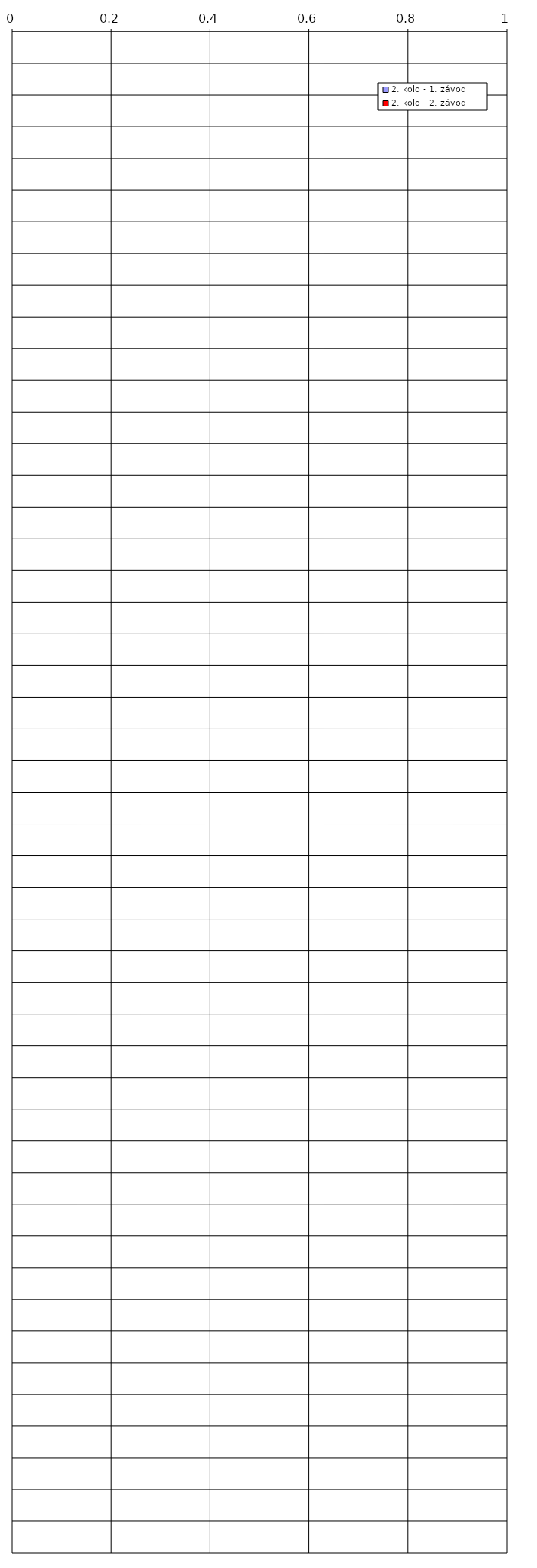
| Category | 2. kolo - 1. závod | 2. kolo - 2. závod |
|---|---|---|
| 0 | 0 | 0 |
| 1 | 0 | 0 |
| 2 | 0 | 0 |
| 3 | 0 | 0 |
| 4 | 0 | 0 |
| 5 | 0 | 0 |
| 6 | 0 | 0 |
| 7 | 0 | 0 |
| 8 | 0 | 0 |
| 9 | 0 | 0 |
| 10 | 0 | 0 |
| 11 | 0 | 0 |
| 12 | 0 | 0 |
| 13 | 0 | 0 |
| 14 | 0 | 0 |
| 15 | 0 | 0 |
| 16 | 0 | 0 |
| 17 | 0 | 0 |
| 18 | 0 | 0 |
| 19 | 0 | 0 |
| 20 | 0 | 0 |
| 21 | 0 | 0 |
| 22 | 0 | 0 |
| 23 | 0 | 0 |
| 24 | 0 | 0 |
| 25 | 0 | 0 |
| 26 | 0 | 0 |
| 27 | 0 | 0 |
| 28 | 0 | 0 |
| 29 | 0 | 0 |
| 30 | 0 | 0 |
| 31 | 0 | 0 |
| 32 | 0 | 0 |
| 33 | 0 | 0 |
| 34 | 0 | 0 |
| 35 | 0 | 0 |
| 36 | 0 | 0 |
| 37 | 0 | 0 |
| 38 | 0 | 0 |
| 39 | 0 | 0 |
| 40 | 0 | 0 |
| 41 | 0 | 0 |
| 42 | 0 | 0 |
| 43 | 0 | 0 |
| 44 | 0 | 0 |
| 45 | 0 | 0 |
| 46 | 0 | 0 |
| 47 | 0 | 0 |